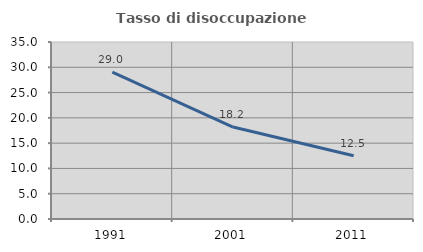
| Category | Tasso di disoccupazione giovanile  |
|---|---|
| 1991.0 | 29.032 |
| 2001.0 | 18.182 |
| 2011.0 | 12.5 |